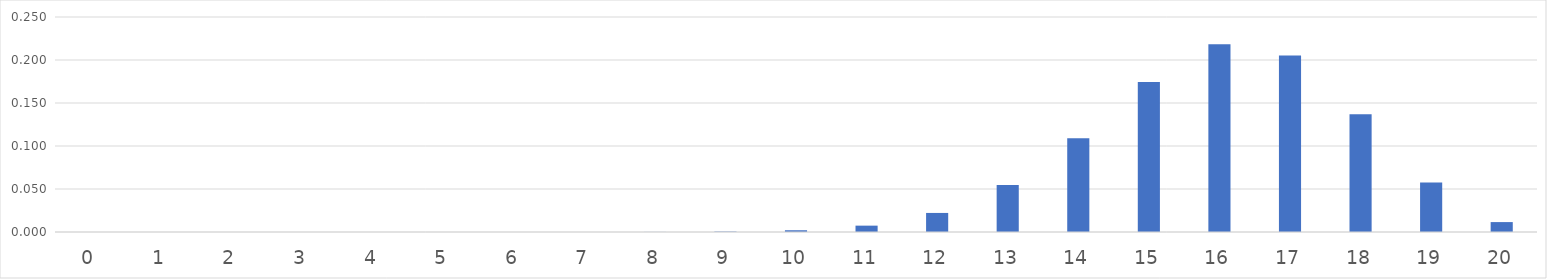
| Category | Series 0 |
|---|---|
| 0.0 | 0 |
| 1.0 | 0 |
| 2.0 | 0 |
| 3.0 | 0 |
| 4.0 | 0 |
| 5.0 | 0 |
| 6.0 | 0 |
| 7.0 | 0 |
| 8.0 | 0 |
| 9.0 | 0 |
| 10.0 | 0.002 |
| 11.0 | 0.007 |
| 12.0 | 0.022 |
| 13.0 | 0.055 |
| 14.0 | 0.109 |
| 15.0 | 0.175 |
| 16.0 | 0.218 |
| 17.0 | 0.205 |
| 18.0 | 0.137 |
| 19.0 | 0.058 |
| 20.0 | 0.012 |